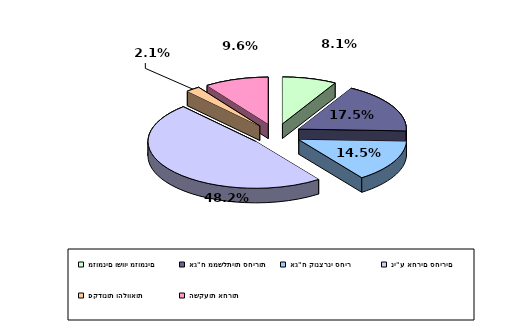
| Category | Series 0 |
|---|---|
| מזומנים ושווי מזומנים | 0.081 |
| אג"ח ממשלתיות סחירות | 0.175 |
| אג"ח קונצרני סחיר | 0.145 |
| ני"ע אחרים סחירים | 0.482 |
| פקדונות והלוואות | 0.021 |
| השקעות אחרות | 0.096 |